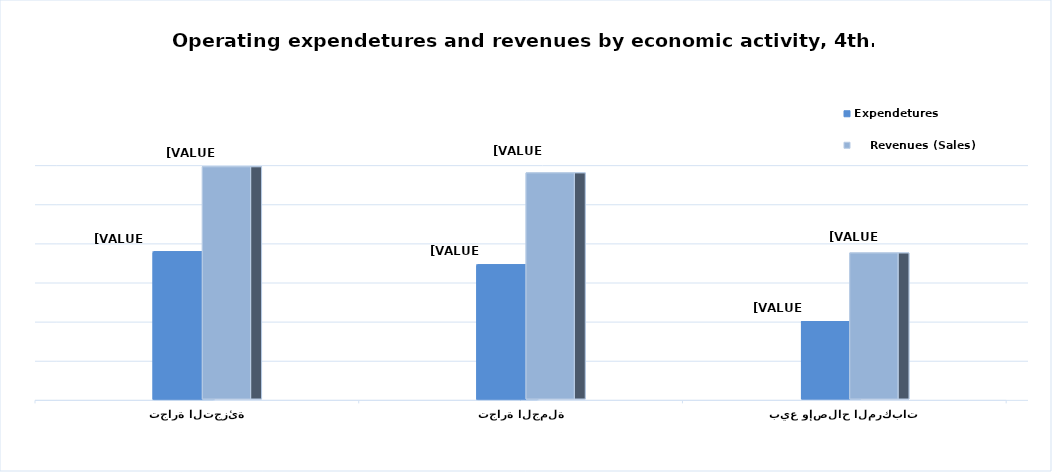
| Category | Expendetures |     Revenues (Sales) |
|---|---|---|
| بيع وإصلاح المركبات  | 19782.333 | 37320.914 |
| تجارة الجملة | 34060.635 | 57793.208 |
| تجارة التجزئة | 37367.647 | 59354.187 |